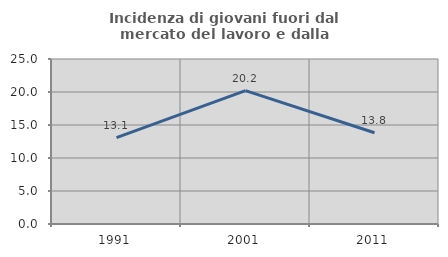
| Category | Incidenza di giovani fuori dal mercato del lavoro e dalla formazione  |
|---|---|
| 1991.0 | 13.095 |
| 2001.0 | 20.219 |
| 2011.0 | 13.83 |